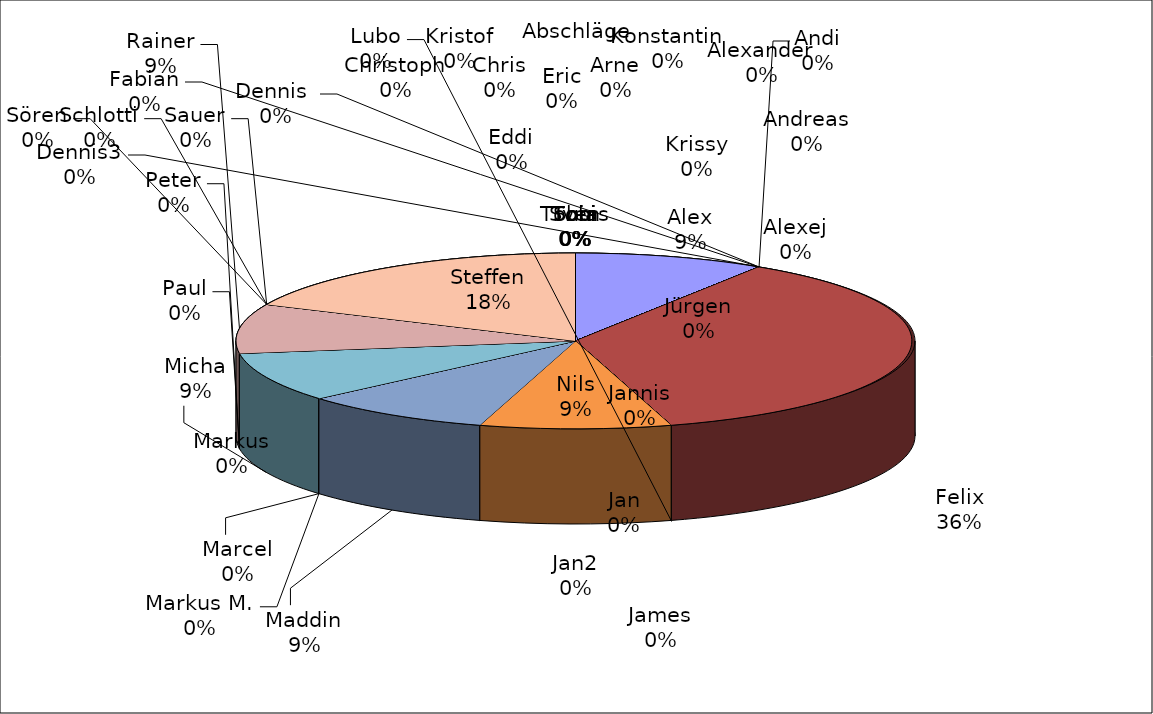
| Category | Series 0 |
|---|---|
| Alex | 1 |
| Alexander | 0 |
| Alexej | 0 |
| Andi | 0 |
| Andreas | 0 |
| Arne | 0 |
| Chris | 0 |
| Christoph | 0 |
| Dennis  | 0 |
| Dennis3 | 0 |
| Eddi | 0 |
| Eric | 0 |
| Fabian | 0 |
| Felix | 4 |
| James | 0 |
| Jan | 0 |
| Jan2 | 0 |
| Jannis | 0 |
| Jürgen | 0 |
| Konstantin | 0 |
| Krissy | 0 |
| Kristof | 0 |
| Lubo | 0 |
| Nils | 1 |
| Maddin | 1 |
| Marcel | 0 |
| Markus | 0 |
| Markus M. | 0 |
| Micha | 1 |
| Paul | 0 |
| Peter | 0 |
| Rainer | 1 |
| Sauer | 0 |
| Schlotti | 0 |
| Sören | 0 |
| Steffen | 2 |
| Susi | 0 |
| Sven | 0 |
| Tobi | 0 |
| Tobias | 0 |
| Tom | 0 |